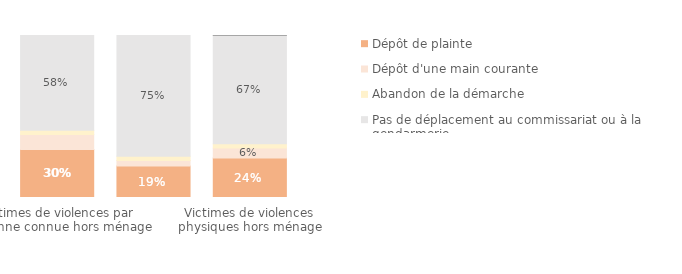
| Category | Dépôt de plainte | Dépôt d'une main courante | Abandon de la démarche | Pas de déplacement au commissariat ou à la gendarmerie | Ne sait pas/Refus |
|---|---|---|---|---|---|
| Victimes de violences par personne connue hors ménage | 0.297 | 0.093 | 0.026 | 0.585 | 0 |
| Victimes de violences par inconnu | 0.194 | 0.035 | 0.026 | 0.745 | 0 |
| Victimes de violences physiques hors ménage | 0.244 | 0.063 | 0.026 | 0.668 | 0 |